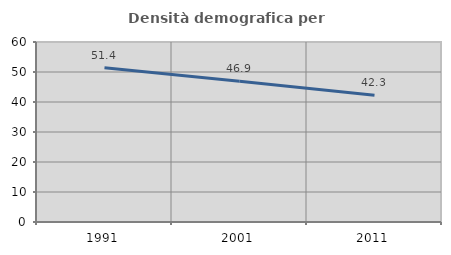
| Category | Densità demografica |
|---|---|
| 1991.0 | 51.423 |
| 2001.0 | 46.883 |
| 2011.0 | 42.276 |